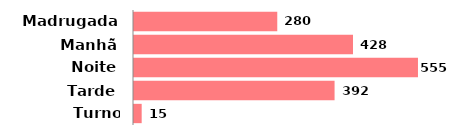
| Category | Qtde |
|---|---|
| Madrugada | 280 |
| Manhã | 428 |
| Noite | 555 |
| Tarde | 392 |
| Turno inválido | 15 |